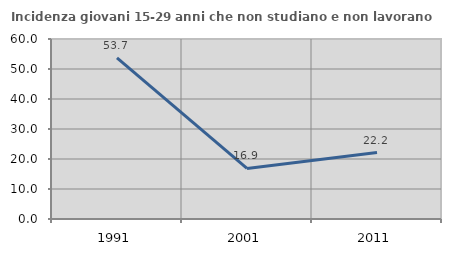
| Category | Incidenza giovani 15-29 anni che non studiano e non lavorano  |
|---|---|
| 1991.0 | 53.713 |
| 2001.0 | 16.864 |
| 2011.0 | 22.159 |